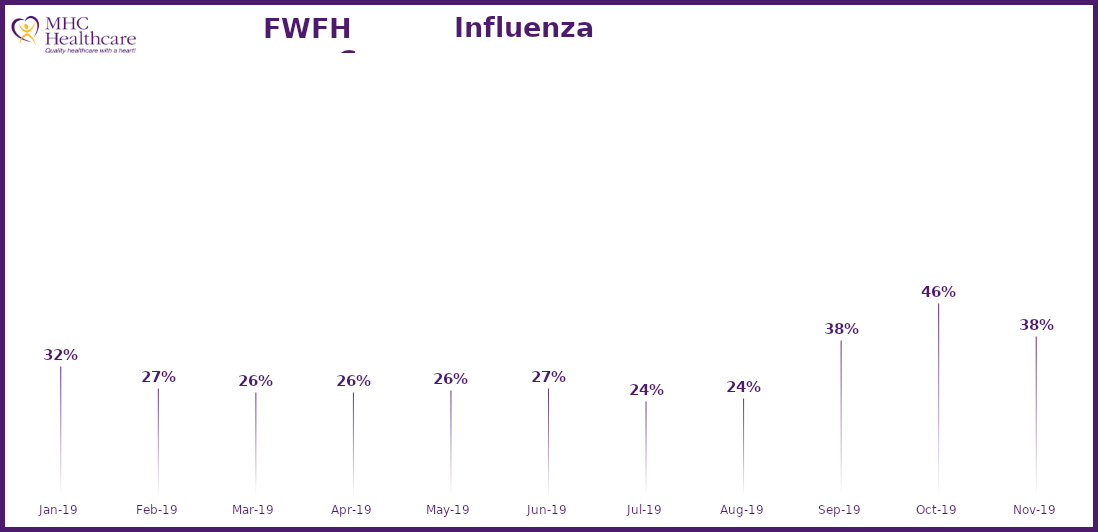
| Category | Online Access to Health Information |
|---|---|
| 2019-01-01 | 0.318 |
| 2019-02-01 | 0.268 |
| 2019-03-01 | 0.259 |
| 2019-04-01 | 0.258 |
| 2019-05-01 | 0.264 |
| 2019-06-01 | 0.267 |
| 2019-07-01 | 0.239 |
| 2019-08-01 | 0.244 |
| 2019-09-01 | 0.377 |
| 2019-10-01 | 0.46 |
| 2019-11-01 | 0.384 |